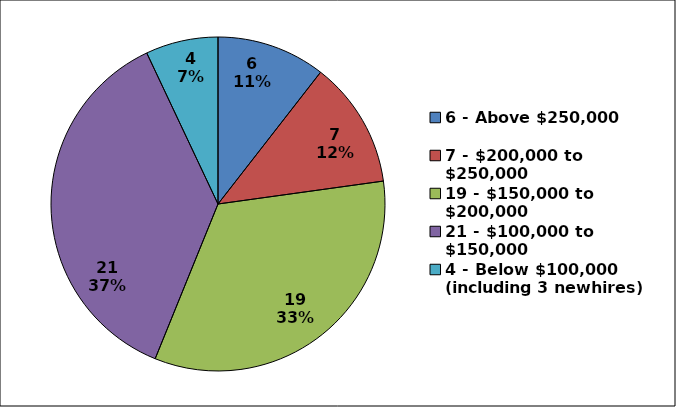
| Category | Series 0 |
|---|---|
| 6 - Above $250,000 | 6 |
| 7 - $200,000 to $250,000 | 7 |
| 19 - $150,000 to $200,000 | 19 |
| 21 - $100,000 to $150,000 | 21 |
| 4 - Below $100,000 (including 3 newhires) | 4 |